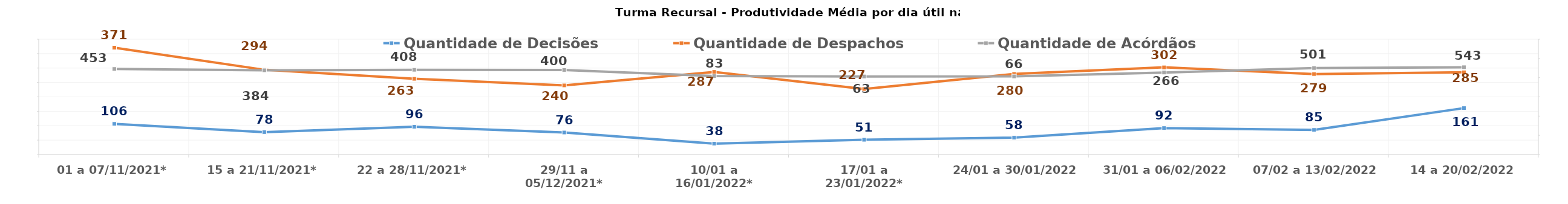
| Category | Quantidade de Decisões | Quantidade de Despachos |
|---|---|---|
| 01 a 07/11/2021* | 106.333 | 370.667 |
| 15 a 21/11/2021* | 77.75 | 294 |
| 22 a 28/11/2021* | 96.4 | 262.6 |
| 29/11 a 05/12/2021* | 76.4 | 239.8 |
| 10/01 a 16/01/2022* | 37.8 | 286.6 |
| 17/01 a 23/01/2022* | 51.2 | 227.2 |
| 24/01 a 30/01/2022 | 58.4 | 279.6 |
| 31/01 a 06/02/2022 | 91.8 | 302.4 |
| 07/02 a 13/02/2022 | 85.4 | 279.2 |
| 14 a 20/02/2022 | 161 | 285.4 |